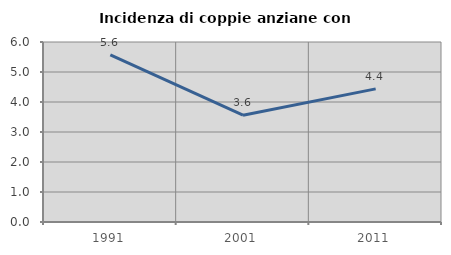
| Category | Incidenza di coppie anziane con figli |
|---|---|
| 1991.0 | 5.574 |
| 2001.0 | 3.56 |
| 2011.0 | 4.438 |